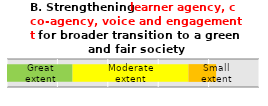
| Category | Series 0 | Series 1 | Series 2 |
|---|---|---|---|
|  | 26 | 46 | 11 |